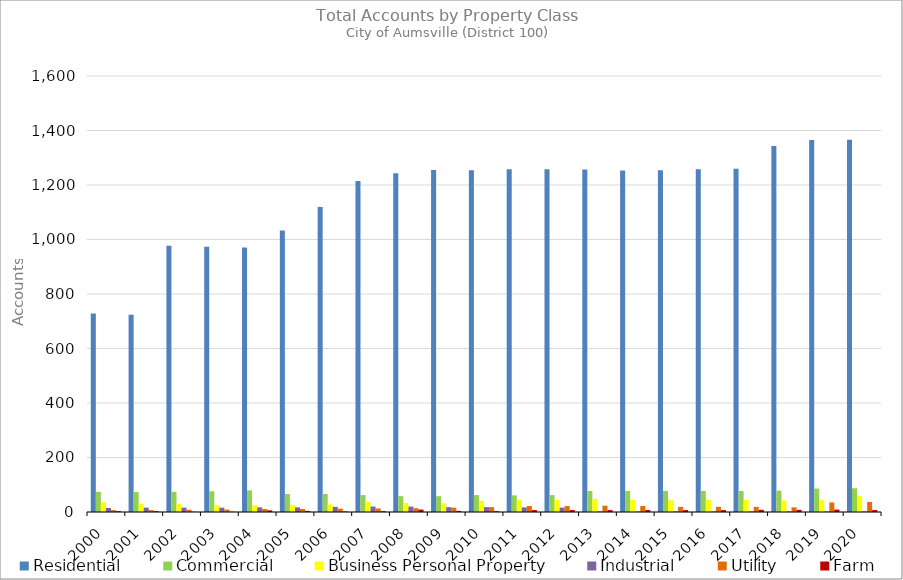
| Category | Residential | Commercial | Business Personal Property | Industrial | Utility | Farm |
|---|---|---|---|---|---|---|
| 2000.0 | 728 | 74 | 36 | 15 | 7 | 3 |
| 2001.0 | 724 | 73 | 30 | 16 | 7 | 3 |
| 2002.0 | 977 | 74 | 29 | 16 | 8 | 1 |
| 2003.0 | 973 | 76 | 25 | 16 | 9 | 1 |
| 2004.0 | 971 | 79 | 25 | 17 | 11 | 6 |
| 2005.0 | 1033 | 66 | 26 | 17 | 11 | 4 |
| 2006.0 | 1119 | 66 | 28 | 19 | 12 | 2 |
| 2007.0 | 1215 | 62 | 37 | 20 | 13 | 3 |
| 2008.0 | 1243 | 58 | 33 | 20 | 14 | 9 |
| 2009.0 | 1255 | 58 | 32 | 18 | 16 | 4 |
| 2010.0 | 1254 | 62 | 41 | 18 | 18 | 3 |
| 2011.0 | 1258 | 61 | 45 | 17 | 22 | 7 |
| 2012.0 | 1258 | 62 | 44 | 16 | 22 | 7 |
| 2013.0 | 1257 | 77 | 48 | 2 | 23 | 7 |
| 2014.0 | 1253 | 77 | 44 | 2 | 22 | 7 |
| 2015.0 | 1254 | 77 | 43 | 2 | 19 | 7 |
| 2016.0 | 1258 | 77 | 45 | 2 | 19 | 7 |
| 2017.0 | 1260 | 77 | 44 | 2 | 19 | 8 |
| 2018.0 | 1343 | 78 | 42 | 2 | 17 | 8 |
| 2019.0 | 1365 | 86 | 45 | 2 | 35 | 9 |
| 2020.0 | 1366 | 87 | 58 | 2 | 37 | 7 |